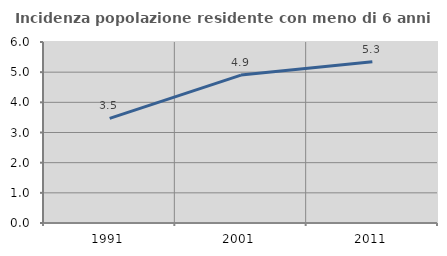
| Category | Incidenza popolazione residente con meno di 6 anni |
|---|---|
| 1991.0 | 3.468 |
| 2001.0 | 4.904 |
| 2011.0 | 5.344 |